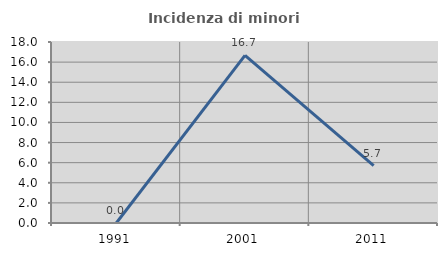
| Category | Incidenza di minori stranieri |
|---|---|
| 1991.0 | 0 |
| 2001.0 | 16.667 |
| 2011.0 | 5.714 |